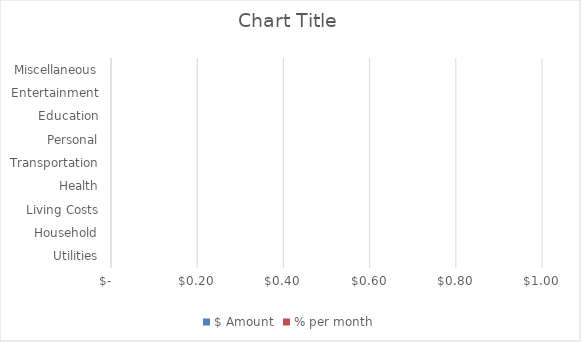
| Category | $ Amount | % per month |
|---|---|---|
| Utilities | 0 | 0 |
| Household | 0 | 0 |
| Living Costs | 0 | 0 |
| Health | 0 | 0 |
| Transportation | 0 | 0 |
| Personal | 0 | 0 |
| Education | 0 | 0 |
| Entertainment | 0 | 0 |
| Miscellaneous | 0 | 0 |